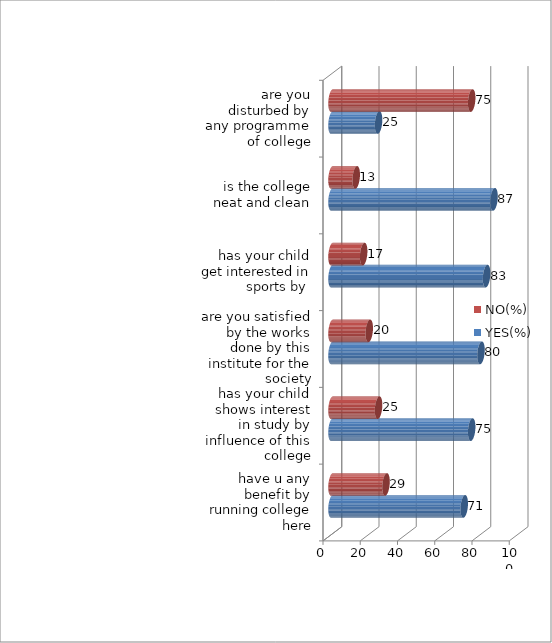
| Category | YES(%) | NO(%) |
|---|---|---|
| have u any benefit by running college here | 71 | 29 |
| has your child shows interest in study by influence of this college | 75 | 25 |
| are you satisfied by the works done by this institute for the society | 80 | 20 |
| has your child get interested in sports by  | 83 | 17 |
| is the college neat and clean | 87 | 13 |
| are you disturbed by any programme of college | 25 | 75 |